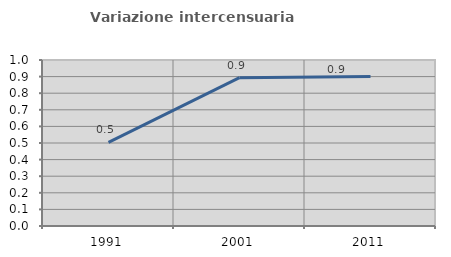
| Category | Variazione intercensuaria annua |
|---|---|
| 1991.0 | 0.504 |
| 2001.0 | 0.894 |
| 2011.0 | 0.9 |